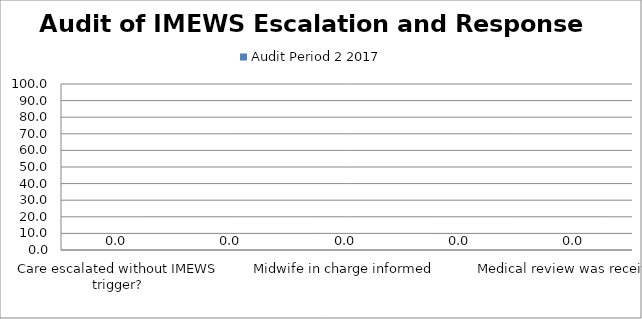
| Category | Audit Period 2 2017 |
|---|---|
| Care escalated without IMEWS trigger? | 0 |
| A full set of observations were completed within the required timeframe | 0 |
| Midwife in charge informed | 0 |
| There is evidence that the care was escalated to the appropriate level as per escalation guide | 0 |
| Medical review was received | 0 |